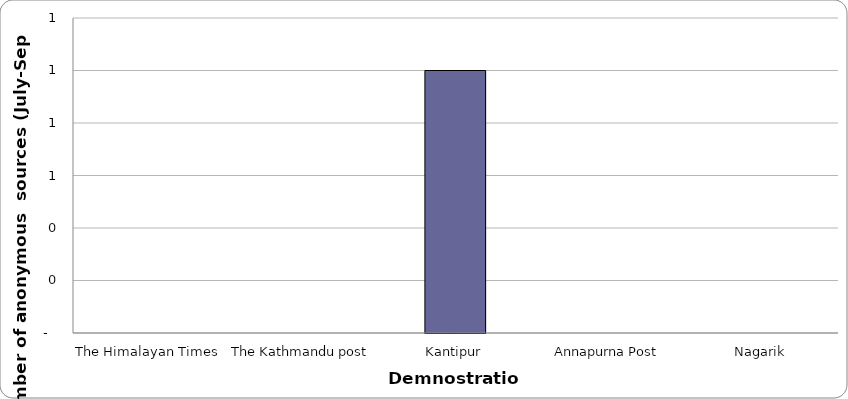
| Category | Demonstration |
|---|---|
| The Himalayan Times | 0 |
| The Kathmandu post | 0 |
| Kantipur | 1 |
| Annapurna Post | 0 |
| Nagarik | 0 |